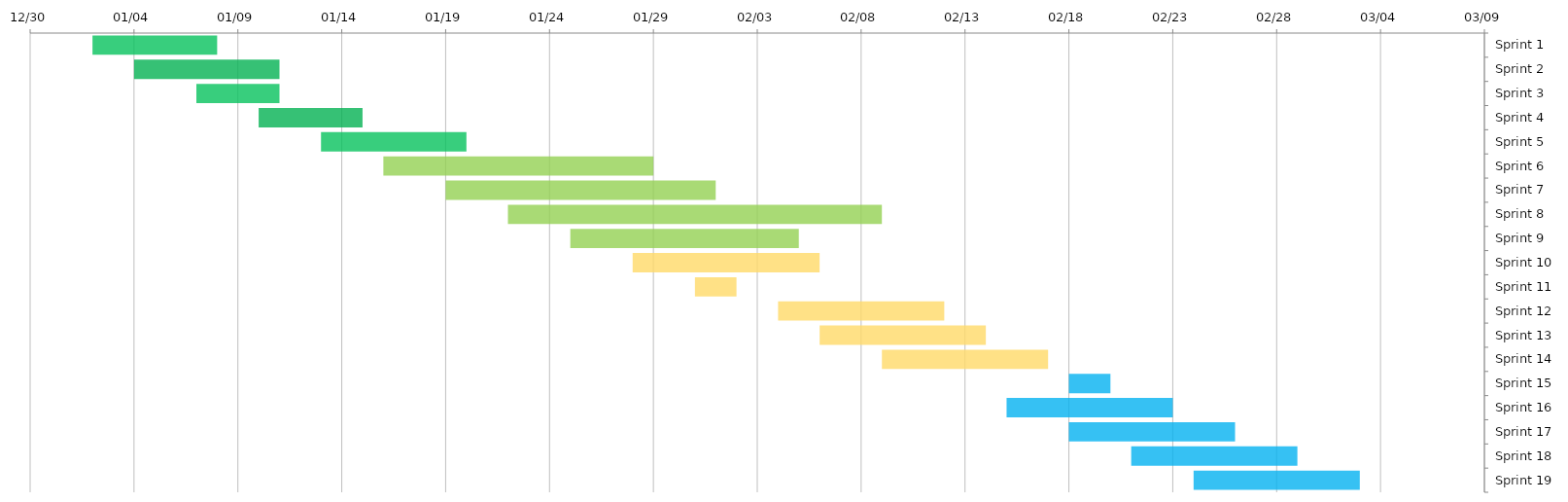
| Category | START DATE | DURATION in days |
|---|---|---|
| Sprint 1 | 2024-01-02 | 6 |
| Sprint 2 | 2024-01-04 | 7 |
| Sprint 3 | 2024-01-07 | 4 |
| Sprint 4 | 2024-01-10 | 5 |
| Sprint 5 | 2024-01-13 | 7 |
| Sprint 6 | 2024-01-16 | 13 |
| Sprint 7 | 2024-01-19 | 13 |
| Sprint 8 | 2024-01-22 | 18 |
| Sprint 9 | 2024-01-25 | 11 |
| Sprint 10 | 2024-01-28 | 9 |
| Sprint 11 | 2024-01-31 | 2 |
| Sprint 12 | 2024-02-04 | 8 |
| Sprint 13 | 2024-02-06 | 8 |
| Sprint 14 | 2024-02-09 | 8 |
| Sprint 15 | 2024-02-18 | 2 |
| Sprint 16 | 2024-02-15 | 8 |
| Sprint 17 | 2024-02-18 | 8 |
| Sprint 18 | 2024-02-21 | 8 |
| Sprint 19 | 2024-02-24 | 8 |